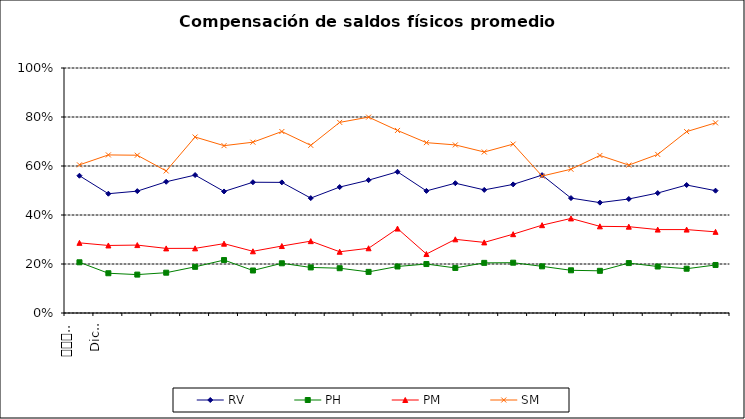
| Category | RV | PH | PM | SM |
|---|---|---|---|---|
| 0 | 0.56 | 0.207 | 0.286 | 0.605 |
| 1 | 0.487 | 0.162 | 0.276 | 0.645 |
| 2 | 0.497 | 0.157 | 0.277 | 0.644 |
| 3 | 0.536 | 0.164 | 0.264 | 0.58 |
| 4 | 0.563 | 0.188 | 0.264 | 0.718 |
| 5 | 0.496 | 0.216 | 0.283 | 0.683 |
| 6 | 0.534 | 0.174 | 0.252 | 0.697 |
| 7 | 0.533 | 0.203 | 0.273 | 0.741 |
| 8 | 0.469 | 0.186 | 0.293 | 0.684 |
| 9 | 0.514 | 0.183 | 0.25 | 0.778 |
| 10 | 0.542 | 0.168 | 0.264 | 0.8 |
| 11 | 0.576 | 0.19 | 0.345 | 0.745 |
| 12 | 0.498 | 0.2 | 0.241 | 0.695 |
| 13 | 0.53 | 0.184 | 0.301 | 0.686 |
| 14 | 0.502 | 0.205 | 0.288 | 0.657 |
| 15 | 0.525 | 0.205 | 0.322 | 0.689 |
| 16 | 0.563 | 0.19 | 0.358 | 0.559 |
| 17 | 0.469 | 0.174 | 0.386 | 0.587 |
| 18 | 0.45 | 0.172 | 0.354 | 0.643 |
| 19 | 0.465 | 0.204 | 0.352 | 0.604 |
| 20 | 0.49 | 0.19 | 0.34 | 0.647 |
| 21 | 0.522 | 0.181 | 0.34 | 0.74 |
| 22 | 0.499 | 0.196 | 0.331 | 0.776 |